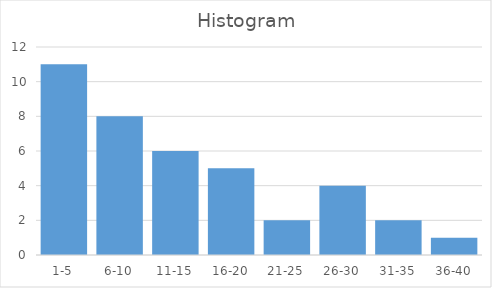
| Category | Total |
|---|---|
| 1-5 | 11 |
| 6-10 | 8 |
| 11-15 | 6 |
| 16-20 | 5 |
| 21-25 | 2 |
| 26-30 | 4 |
| 31-35 | 2 |
| 36-40 | 1 |